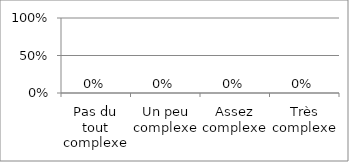
| Category | Series 0 |
|---|---|
| Pas du tout complexe | 0 |
| Un peu complexe | 0 |
| Assez complexe | 0 |
| Très complexe | 0 |